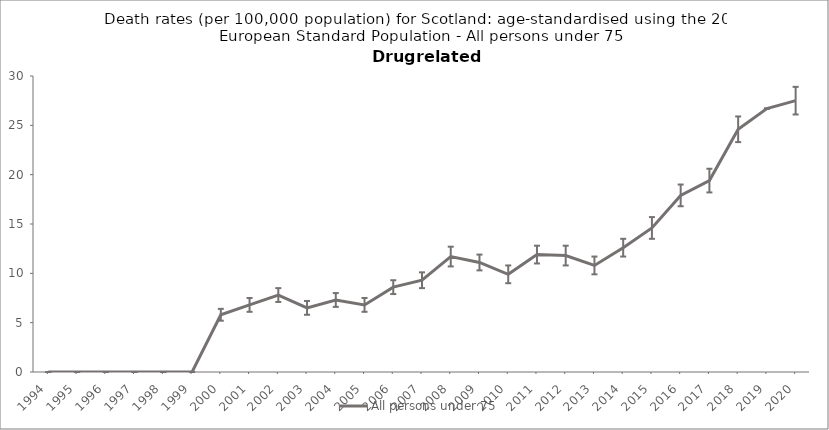
| Category | All persons under 75 |
|---|---|
| 1994.0 | 0 |
| 1995.0 | 0 |
| 1996.0 | 0 |
| 1997.0 | 0 |
| 1998.0 | 0 |
| 1999.0 | 0 |
| 2000.0 | 5.8 |
| 2001.0 | 6.8 |
| 2002.0 | 7.8 |
| 2003.0 | 6.5 |
| 2004.0 | 7.3 |
| 2005.0 | 6.8 |
| 2006.0 | 8.6 |
| 2007.0 | 9.3 |
| 2008.0 | 11.7 |
| 2009.0 | 11.1 |
| 2010.0 | 9.9 |
| 2011.0 | 11.9 |
| 2012.0 | 11.8 |
| 2013.0 | 10.8 |
| 2014.0 | 12.6 |
| 2015.0 | 14.6 |
| 2016.0 | 17.9 |
| 2017.0 | 19.4 |
| 2018.0 | 24.6 |
| 2019.0 | 26.7 |
| 2020.0 | 27.5 |